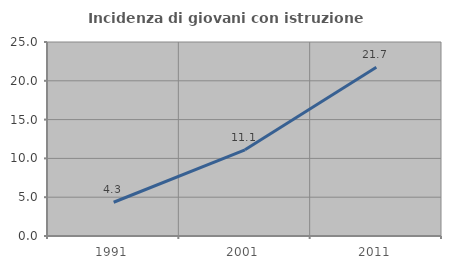
| Category | Incidenza di giovani con istruzione universitaria |
|---|---|
| 1991.0 | 4.348 |
| 2001.0 | 11.111 |
| 2011.0 | 21.739 |